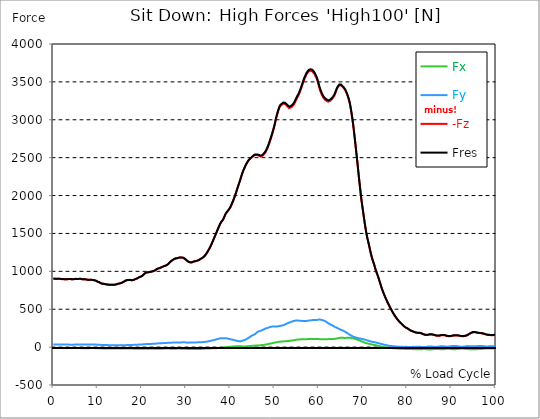
| Category |  Fx |  Fy |  -Fz |  Fres |
|---|---|---|---|---|
| 0.0 | -12.904 | 33.914 | 901.258 | 902.026 |
| 0.167348456675344 | -13.024 | 33.95 | 902.014 | 902.781 |
| 0.334696913350688 | -13.132 | 33.902 | 902.757 | 903.525 |
| 0.5020453700260321 | -12.916 | 33.854 | 901.21 | 901.966 |
| 0.669393826701376 | -12.64 | 33.83 | 899.699 | 900.455 |
| 0.83674228337672 | -12.64 | 33.686 | 900.743 | 901.498 |
| 1.0040907400520642 | -12.724 | 33.602 | 902.146 | 902.889 |
| 1.1621420602454444 | -13.012 | 33.471 | 902.997 | 903.741 |
| 1.3294905169207885 | -13.108 | 33.315 | 902.41 | 903.153 |
| 1.4968389735961325 | -13.168 | 33.183 | 901.114 | 901.846 |
| 1.6641874302714765 | -13.108 | 33.051 | 899.196 | 899.939 |
| 1.8315358869468206 | -13.06 | 32.979 | 897.493 | 898.224 |
| 1.9988843436221646 | -13.036 | 32.967 | 896.198 | 896.941 |
| 2.1662328002975086 | -13.228 | 33.099 | 896.773 | 897.505 |
| 2.333581256972853 | -13.431 | 33.075 | 897.373 | 898.116 |
| 2.5009297136481967 | -13.204 | 33.015 | 895.502 | 896.246 |
| 2.6682781703235405 | -13.06 | 32.811 | 894.375 | 895.106 |
| 2.8356266269988843 | -13.311 | 32.799 | 894.866 | 895.598 |
| 3.002975083674229 | -13.491 | 32.991 | 895.898 | 896.629 |
| 3.1703235403495724 | -13.491 | 32.967 | 896.354 | 897.097 |
| 3.337671997024917 | -13.323 | 32.919 | 896.761 | 897.493 |
| 3.4957233172182973 | -13.144 | 32.847 | 897.96 | 898.68 |
| 3.663071773893641 | -13.192 | 32.691 | 899.172 | 899.891 |
| 3.8304202305689854 | -13.12 | 32.595 | 898.056 | 898.776 |
| 3.997768687244329 | -12.904 | 32.487 | 896.401 | 897.109 |
| 4.165117143919673 | -12.772 | 32.523 | 895.586 | 896.306 |
| 4.332465600595017 | -12.784 | 32.619 | 895.106 | 895.826 |
| 4.499814057270361 | -12.892 | 32.727 | 895.238 | 895.958 |
| 4.667162513945706 | -12.868 | 32.799 | 896.593 | 897.313 |
| 4.834510970621049 | -12.952 | 32.871 | 898.476 | 899.196 |
| 5.001859427296393 | -13.06 | 32.955 | 899.939 | 900.671 |
| 5.169207883971737 | -13.06 | 33.063 | 899.831 | 900.575 |
| 5.336556340647081 | -12.988 | 33.159 | 899.567 | 900.299 |
| 5.503904797322425 | -12.904 | 33.279 | 898.2 | 898.944 |
| 5.671253253997769 | -12.976 | 33.327 | 899.663 | 900.407 |
| 5.82930457419115 | -13.275 | 33.351 | 901.198 | 901.942 |
| 5.996653030866494 | -13.467 | 33.291 | 900.935 | 901.678 |
| 6.164001487541838 | -13.455 | 33.099 | 900.203 | 900.947 |
| 6.331349944217181 | -13.659 | 33.111 | 899.292 | 900.035 |
| 6.498698400892526 | -13.539 | 33.075 | 896.114 | 896.857 |
| 6.66604685756787 | -13.455 | 33.147 | 893.715 | 894.459 |
| 6.833395314243213 | -13.599 | 33.339 | 893.643 | 894.399 |
| 7.000743770918558 | -13.767 | 33.531 | 894.015 | 894.783 |
| 7.168092227593902 | -13.875 | 33.566 | 894.291 | 895.058 |
| 7.335440684269246 | -13.875 | 33.495 | 893.655 | 894.423 |
| 7.50278914094459 | -13.779 | 33.447 | 891.76 | 892.528 |
| 7.6701375976199335 | -13.575 | 33.387 | 889.338 | 890.094 |
| 7.837486054295278 | -13.455 | 33.339 | 887.671 | 888.427 |
| 7.995537374488658 | -13.515 | 33.303 | 887.251 | 888.007 |
| 8.162885831164003 | -13.539 | 33.255 | 886.976 | 887.731 |
| 8.330234287839346 | -13.407 | 33.195 | 887.275 | 888.031 |
| 8.49758274451469 | -13.335 | 33.159 | 887.587 | 888.343 |
| 8.664931201190035 | -13.287 | 33.135 | 887.911 | 888.654 |
| 8.832279657865378 | -13.216 | 33.207 | 886.736 | 887.479 |
| 8.999628114540721 | -12.928 | 33.171 | 883.941 | 884.685 |
| 9.166976571216066 | -13.048 | 33.015 | 881.795 | 882.538 |
| 9.334325027891412 | -13.299 | 32.943 | 881.063 | 881.807 |
| 9.501673484566755 | -13.599 | 32.955 | 879.085 | 879.84 |
| 9.669021941242098 | -13.647 | 32.979 | 875.007 | 875.775 |
| 9.836370397917442 | -14.511 | 32.295 | 867.884 | 868.639 |
| 10.003718854592787 | -14.834 | 31.708 | 862.727 | 863.483 |
| 10.17106731126813 | -14.966 | 31.348 | 860.688 | 861.432 |
| 10.329118631461512 | -14.99 | 31.24 | 857.498 | 858.254 |
| 10.496467088136853 | -15.422 | 30.544 | 851.634 | 852.378 |
| 10.663815544812199 | -16.13 | 29.609 | 845.146 | 845.89 |
| 10.831164001487544 | -16.741 | 28.746 | 839.654 | 840.397 |
| 10.998512458162887 | -16.909 | 28.302 | 837.111 | 837.843 |
| 11.16586091483823 | -17.125 | 28.206 | 836.752 | 837.495 |
| 11.333209371513574 | -17.209 | 28.014 | 835.576 | 836.32 |
| 11.50055782818892 | -17.305 | 27.894 | 833.586 | 834.341 |
| 11.667906284864264 | -17.461 | 27.654 | 831.055 | 831.799 |
| 11.835254741539607 | -17.653 | 27.235 | 828.789 | 829.532 |
| 12.00260319821495 | -17.857 | 26.863 | 827.134 | 827.865 |
| 12.169951654890292 | -18.072 | 26.503 | 825.683 | 826.414 |
| 12.337300111565641 | -18.156 | 26.431 | 824.759 | 825.491 |
| 12.504648568240984 | -18.228 | 26.203 | 823.812 | 824.544 |
| 12.662699888434362 | -18.3 | 25.795 | 822.829 | 823.548 |
| 12.830048345109708 | -18.384 | 25.364 | 822.337 | 823.056 |
| 12.997396801785053 | -18.456 | 24.944 | 822.013 | 822.721 |
| 13.164745258460396 | -18.444 | 24.848 | 821.749 | 822.457 |
| 13.33209371513574 | -18.372 | 24.728 | 821.701 | 822.409 |
| 13.499442171811083 | -18.288 | 24.596 | 821.725 | 822.421 |
| 13.666790628486426 | -18.336 | 24.524 | 822.349 | 823.044 |
| 13.834139085161771 | -18.492 | 24.524 | 823.404 | 824.112 |
| 14.001487541837117 | -18.768 | 24.62 | 824.711 | 825.431 |
| 14.16883599851246 | -18.864 | 24.44 | 826.75 | 827.47 |
| 14.336184455187803 | -18.852 | 24.26 | 829.28 | 829.988 |
| 14.503532911863147 | -18.768 | 24.129 | 832.267 | 832.974 |
| 14.670881368538492 | -18.756 | 24.308 | 836.02 | 836.728 |
| 14.828932688731873 | -19.008 | 24.165 | 838.587 | 839.306 |
| 14.996281145407215 | -19.164 | 24.057 | 840.205 | 840.925 |
| 15.163629602082558 | -19.176 | 24.093 | 842.052 | 842.784 |
| 15.330978058757903 | -19.296 | 24.165 | 845.362 | 846.094 |
| 15.498326515433247 | -19.26 | 24.368 | 849.356 | 850.075 |
| 15.665674972108594 | -19.248 | 24.524 | 853.985 | 854.716 |
| 15.833023428783937 | -19.104 | 24.692 | 859.657 | 860.377 |
| 16.00037188545928 | -18.864 | 24.872 | 865.641 | 866.361 |
| 16.167720342134626 | -18.852 | 25.184 | 871.949 | 872.669 |
| 16.335068798809967 | -19.056 | 25.628 | 876.974 | 877.717 |
| 16.502417255485312 | -18.876 | 26.071 | 881.039 | 881.783 |
| 16.669765712160658 | -18.972 | 26.467 | 883.69 | 884.445 |
| 16.837114168836 | -18.84 | 26.611 | 884.481 | 885.225 |
| 17.004462625511344 | -18.588 | 26.839 | 884.685 | 885.44 |
| 17.16251394570472 | -18.6 | 27.462 | 886.04 | 886.82 |
| 17.32986240238007 | -18.792 | 27.99 | 886.796 | 887.599 |
| 17.497210859055414 | -19.08 | 28.47 | 884.157 | 884.973 |
| 17.664559315730756 | -19.44 | 28.889 | 881.687 | 882.538 |
| 17.8319077724061 | -19.667 | 29.117 | 882.311 | 883.174 |
| 17.999256229081443 | -19.811 | 29.357 | 883.965 | 884.829 |
| 18.166604685756788 | -19.799 | 29.573 | 887.035 | 887.911 |
| 18.333953142432133 | -20.135 | 29.837 | 891.101 | 891.976 |
| 18.501301599107478 | -20.447 | 30.317 | 895.886 | 896.785 |
| 18.668650055782823 | -20.651 | 31.12 | 900.767 | 901.702 |
| 18.835998512458165 | -20.567 | 31.264 | 903.249 | 904.184 |
| 19.00334696913351 | -20.555 | 31.78 | 907.338 | 908.286 |
| 19.170695425808855 | -20.795 | 32.571 | 913.634 | 914.606 |
| 19.338043882484197 | -21.059 | 33.423 | 919.87 | 920.878 |
| 19.496095202677576 | -21.214 | 34.106 | 923.972 | 924.991 |
| 19.66344365935292 | -21.226 | 34.166 | 927.306 | 928.337 |
| 19.830792116028263 | -21.406 | 34.562 | 931.263 | 932.294 |
| 19.998140572703612 | -21.658 | 35.03 | 935.988 | 937.043 |
| 20.165489029378953 | -22.042 | 35.773 | 943.795 | 944.886 |
| 20.3328374860543 | -22.186 | 36.589 | 952.226 | 953.329 |
| 20.500185942729644 | -22.27 | 37.56 | 962.503 | 963.642 |
| 20.667534399404985 | -22.342 | 38.447 | 971.785 | 972.948 |
| 20.83488285608033 | -22.438 | 39.263 | 978.657 | 979.844 |
| 21.002231312755672 | -22.174 | 39.85 | 983.202 | 984.413 |
| 21.16957976943102 | -22.222 | 39.994 | 985.576 | 986.788 |
| 21.336928226106362 | -22.402 | 40.354 | 986.668 | 987.903 |
| 21.504276682781704 | -22.606 | 40.75 | 987.519 | 988.79 |
| 21.67162513945705 | -22.51 | 41.05 | 988.371 | 989.654 |
| 21.82967645965043 | -22.39 | 41.338 | 989.222 | 990.505 |
| 21.997024916325774 | -22.462 | 41.901 | 992.46 | 993.767 |
| 22.16437337300112 | -22.486 | 42.477 | 995.554 | 996.873 |
| 22.33172182967646 | -22.318 | 43.028 | 997.904 | 999.248 |
| 22.499070286351806 | -22.162 | 43.544 | 1000.483 | 1001.838 |
| 22.666418743027148 | -22.054 | 44 | 1003.421 | 1004.788 |
| 22.833767199702496 | -21.934 | 44.444 | 1006.359 | 1007.738 |
| 23.00111565637784 | -21.946 | 45.223 | 1012.067 | 1013.482 |
| 23.168464113053183 | -22.198 | 46.194 | 1019.323 | 1020.774 |
| 23.335812569728528 | -22.33 | 47.118 | 1026.23 | 1027.717 |
| 23.50316102640387 | -22.078 | 48.137 | 1031.963 | 1033.462 |
| 23.670509483079215 | -21.682 | 49.133 | 1036.76 | 1038.295 |
| 23.83785793975456 | -21.502 | 49.72 | 1039.314 | 1040.861 |
| 23.995909259947936 | -21.598 | 50.092 | 1041.46 | 1043.019 |
| 24.163257716623285 | -21.586 | 50.44 | 1044.998 | 1046.569 |
| 24.330606173298627 | -21.442 | 51.027 | 1049.915 | 1051.498 |
| 24.49795462997397 | -21.202 | 51.651 | 1054.004 | 1055.611 |
| 24.665303086649313 | -20.807 | 52.37 | 1057.11 | 1058.741 |
| 24.83265154332466 | -20.375 | 52.958 | 1062.795 | 1064.426 |
| 25.0 | -19.907 | 53.282 | 1068.143 | 1069.75 |
| 25.167348456675345 | -19.523 | 53.702 | 1071.225 | 1072.844 |
| 25.334696913350694 | -18.792 | 54.517 | 1072.317 | 1073.972 |
| 25.502045370026035 | -18.456 | 55.249 | 1077.126 | 1078.793 |
| 25.669393826701377 | -18.3 | 55.68 | 1082.594 | 1084.261 |
| 25.836742283376722 | -18.048 | 56.016 | 1088.422 | 1090.077 |
| 26.004090740052067 | -18.252 | 56.64 | 1096.745 | 1098.4 |
| 26.17143919672741 | -19.416 | 57.707 | 1106.471 | 1108.198 |
| 26.329490516920792 | -20.507 | 58.187 | 1118.691 | 1120.43 |
| 26.49683897359613 | -21.011 | 58.558 | 1128.597 | 1130.36 |
| 26.66418743027148 | -21.346 | 58.906 | 1136.14 | 1137.903 |
| 26.831535886946828 | -21.442 | 59.194 | 1142.868 | 1144.63 |
| 26.998884343622166 | -21.214 | 59.326 | 1149.307 | 1151.07 |
| 27.166232800297514 | -20.951 | 59.494 | 1156.131 | 1157.882 |
| 27.333581256972852 | -20.831 | 59.626 | 1161.971 | 1163.71 |
| 27.5009297136482 | -20.843 | 59.71 | 1166.576 | 1168.315 |
| 27.668278170323543 | -21.094 | 59.722 | 1169.994 | 1171.733 |
| 27.835626626998888 | -20.915 | 59.878 | 1171.253 | 1173.016 |
| 28.002975083674233 | -19.943 | 59.926 | 1172.165 | 1173.928 |
| 28.170323540349575 | -19.344 | 60.321 | 1175.654 | 1177.429 |
| 28.33767199702492 | -19.26 | 60.861 | 1178.916 | 1180.727 |
| 28.50502045370026 | -19.488 | 61.209 | 1180.967 | 1182.79 |
| 28.663071773893645 | -19.967 | 61.664 | 1181.902 | 1183.761 |
| 28.830420230568986 | -20.339 | 62.048 | 1181.855 | 1183.737 |
| 28.99776868724433 | -20.531 | 62.408 | 1181.195 | 1183.114 |
| 29.165117143919673 | -20.711 | 62.756 | 1180.487 | 1182.418 |
| 29.33246560059502 | -20.639 | 63.092 | 1178.029 | 1179.984 |
| 29.499814057270367 | -21.142 | 63.092 | 1173.4 | 1175.379 |
| 29.66716251394571 | -21.55 | 62.768 | 1167.416 | 1169.395 |
| 29.834510970621054 | -21.982 | 62.516 | 1159.093 | 1161.084 |
| 30.00185942729639 | -22.558 | 61.7 | 1150.854 | 1152.821 |
| 30.169207883971744 | -23.313 | 60.537 | 1142.256 | 1144.211 |
| 30.33655634064708 | -24.236 | 58.774 | 1133.346 | 1135.252 |
| 30.50390479732243 | -24.584 | 58.798 | 1126.45 | 1128.381 |
| 30.671253253997772 | -24.584 | 59.254 | 1121.773 | 1123.752 |
| 30.829304574191156 | -24.524 | 59.674 | 1118.451 | 1120.466 |
| 30.996653030866494 | -24.884 | 60.189 | 1117.156 | 1119.231 |
| 31.164001487541842 | -25.316 | 60.645 | 1116.376 | 1118.499 |
| 31.331349944217187 | -25.915 | 61.113 | 1118.019 | 1120.19 |
| 31.498698400892525 | -26.107 | 61.868 | 1122.732 | 1124.951 |
| 31.666046857567874 | -26.215 | 62.276 | 1127.218 | 1129.46 |
| 31.833395314243212 | -26.227 | 62.276 | 1130.168 | 1132.41 |
| 32.00074377091856 | -25.843 | 61.724 | 1131.247 | 1133.454 |
| 32.1680922275939 | -25.652 | 61.581 | 1132.866 | 1135.049 |
| 32.33544068426925 | -25.64 | 61.808 | 1134.977 | 1137.171 |
| 32.50278914094459 | -25.532 | 62.612 | 1138.634 | 1140.877 |
| 32.670137597619934 | -25.352 | 63.439 | 1142.712 | 1144.99 |
| 32.83748605429528 | -24.86 | 63.775 | 1147.293 | 1149.583 |
| 33.004834510970625 | -24.428 | 64.171 | 1152.042 | 1154.344 |
| 33.162885831164004 | -24.248 | 64.77 | 1157.378 | 1159.705 |
| 33.33023428783935 | -24.057 | 64.89 | 1164.142 | 1166.492 |
| 33.497582744514695 | -23.169 | 65.382 | 1169.634 | 1171.997 |
| 33.664931201190036 | -22.078 | 65.706 | 1174.431 | 1176.806 |
| 33.83227965786538 | -21.586 | 66.617 | 1182.394 | 1184.829 |
| 33.99962811454073 | -21.106 | 67.541 | 1190.369 | 1192.851 |
| 34.16697657121607 | -20.567 | 68.488 | 1199.903 | 1202.445 |
| 34.33432502789141 | -20.027 | 69.4 | 1210.696 | 1213.286 |
| 34.50167348456676 | -19.631 | 70.287 | 1224.379 | 1227.03 |
| 34.6690219412421 | -19.332 | 71.534 | 1238.35 | 1241.049 |
| 34.83637039791744 | -19.02 | 73.309 | 1253.077 | 1255.859 |
| 35.00371885459279 | -18.684 | 75.432 | 1269.95 | 1272.84 |
| 35.17106731126814 | -18.408 | 77.554 | 1287.027 | 1290.025 |
| 35.338415767943474 | -17.917 | 79.845 | 1305.759 | 1308.853 |
| 35.49646708813686 | -17.401 | 82.195 | 1325.151 | 1328.329 |
| 35.6638155448122 | -16.897 | 84.534 | 1345.55 | 1348.823 |
| 35.831164001487544 | -16.393 | 86.836 | 1367.352 | 1370.697 |
| 35.998512458162885 | -15.71 | 89.019 | 1389.142 | 1392.547 |
| 36.165860914838234 | -15.254 | 91.046 | 1411.879 | 1415.333 |
| 36.333209371513576 | -14.87 | 93.036 | 1434.353 | 1437.866 |
| 36.50055782818892 | -14.451 | 95.267 | 1457.654 | 1461.227 |
| 36.667906284864266 | -14.055 | 98.121 | 1481.075 | 1484.744 |
| 36.83525474153961 | -13.767 | 101.419 | 1504.172 | 1507.973 |
| 37.002603198214956 | -13.263 | 104.333 | 1527.893 | 1531.79 |
| 37.1699516548903 | -12.268 | 106.852 | 1550.99 | 1554.959 |
| 37.337300111565646 | -11.285 | 109.274 | 1573.535 | 1577.589 |
| 37.50464856824098 | -10.565 | 112.896 | 1595.673 | 1599.859 |
| 37.66269988843437 | -9.366 | 115.558 | 1617.919 | 1622.2 |
| 37.83004834510971 | -8.563 | 117.681 | 1636.567 | 1640.932 |
| 37.99739680178505 | -7.651 | 118.268 | 1651.533 | 1655.887 |
| 38.16474525846039 | -7.016 | 117.621 | 1663.226 | 1667.495 |
| 38.33209371513574 | -6.272 | 116.829 | 1676.298 | 1680.471 |
| 38.49944217181109 | -5.097 | 116.577 | 1696.073 | 1700.186 |
| 38.666790628486424 | -3.778 | 117.177 | 1719.146 | 1723.26 |
| 38.83413908516178 | -2.554 | 118.448 | 1741.164 | 1745.289 |
| 39.001487541837115 | -1.355 | 118.46 | 1760.831 | 1764.885 |
| 39.16883599851246 | -0.156 | 117.177 | 1775.774 | 1779.695 |
| 39.336184455187805 | 1.031 | 114.443 | 1787.622 | 1791.34 |
| 39.503532911863154 | 2.207 | 111.708 | 1799.471 | 1802.996 |
| 39.670881368538495 | 2.914 | 108.854 | 1813.238 | 1816.584 |
| 39.83822982521384 | 3.382 | 105.952 | 1827.928 | 1831.106 |
| 39.996281145407224 | 3.874 | 104.093 | 1843.566 | 1846.624 |
| 40.163629602082565 | 4.677 | 102.318 | 1863.474 | 1866.412 |
| 40.33097805875791 | 5.852 | 100.088 | 1886.007 | 1888.813 |
| 40.498326515433256 | 7.075 | 97.953 | 1909.44 | 1912.102 |
| 40.6656749721086 | 7.999 | 95.675 | 1933.077 | 1935.607 |
| 40.83302342878393 | 9.234 | 93.024 | 1959.136 | 1961.523 |
| 41.00037188545929 | 10.002 | 90.47 | 1986.815 | 1989.069 |
| 41.16772034213463 | 10.889 | 87.952 | 2014.205 | 2016.328 |
| 41.33506879880997 | 11.477 | 85.829 | 2042.543 | 2044.534 |
| 41.50241725548531 | 11.956 | 83.502 | 2072.716 | 2074.562 |
| 41.66976571216066 | 12.28 | 80.277 | 2103.572 | 2105.263 |
| 41.837114168836 | 11.92 | 78.274 | 2133.481 | 2135.064 |
| 42.004462625511344 | 11.489 | 77.506 | 2163.006 | 2164.541 |
| 42.17181108218669 | 11.045 | 77.207 | 2191.835 | 2193.334 |
| 42.32986240238007 | 10.481 | 78.058 | 2221.576 | 2223.075 |
| 42.497210859055414 | 10.193 | 80.372 | 2253.704 | 2255.275 |
| 42.66455931573076 | 9.774 | 82.639 | 2284.392 | 2286.047 |
| 42.831907772406105 | 9.45 | 85.889 | 2311.207 | 2312.982 |
| 42.999256229081446 | 9.138 | 89.81 | 2336.259 | 2338.189 |
| 43.16660468575679 | 8.946 | 92.713 | 2357.893 | 2359.943 |
| 43.33395314243214 | 9.006 | 95.891 | 2379.347 | 2381.494 |
| 43.50130159910748 | 9.426 | 100.568 | 2399.878 | 2402.204 |
| 43.66865005578282 | 10.014 | 105.952 | 2418.742 | 2421.296 |
| 43.83599851245817 | 10.745 | 111.684 | 2436.251 | 2439.057 |
| 44.00334696913351 | 11.441 | 117.729 | 2451.817 | 2454.899 |
| 44.17069542580886 | 12.208 | 124.013 | 2465.188 | 2468.57 |
| 44.3380438824842 | 12.94 | 130.536 | 2476.305 | 2480.034 |
| 44.49609520267758 | 13.755 | 137.012 | 2485.755 | 2489.844 |
| 44.66344365935292 | 14.799 | 143.5 | 2494.533 | 2499.006 |
| 44.83079211602827 | 15.758 | 149.652 | 2503.132 | 2508.013 |
| 44.99814057270361 | 16.669 | 155.133 | 2510.999 | 2516.227 |
| 45.16548902937895 | 17.521 | 159.786 | 2517.93 | 2523.471 |
| 45.332837486054295 | 18.312 | 163.407 | 2527.584 | 2533.328 |
| 45.500185942729644 | 19.116 | 168.24 | 2534.156 | 2540.188 |
| 45.66753439940499 | 19.631 | 174.212 | 2535.439 | 2541.855 |
| 45.83488285608033 | 20.363 | 183.53 | 2534.276 | 2541.543 |
| 46.00223131275568 | 21.106 | 192.968 | 2533.041 | 2541.183 |
| 46.16957976943102 | 21.766 | 199.6 | 2532.405 | 2541.279 |
| 46.336928226106366 | 22.462 | 205.788 | 2531.206 | 2540.764 |
| 46.50427668278171 | 23.265 | 209.71 | 2526.804 | 2536.782 |
| 46.671625139457056 | 23.001 | 210.669 | 2517.99 | 2528.088 |
| 46.829676459650436 | 24.248 | 214.71 | 2515.975 | 2526.409 |
| 46.99702491632577 | 25.628 | 218.836 | 2517.954 | 2528.747 |
| 47.16437337300112 | 26.767 | 222.817 | 2521.888 | 2533.041 |
| 47.33172182967646 | 27.798 | 226.955 | 2528.747 | 2540.236 |
| 47.49907028635181 | 29.009 | 231.632 | 2537.993 | 2549.878 |
| 47.66641874302716 | 30.472 | 237.052 | 2548.942 | 2561.294 |
| 47.83376719970249 | 31.948 | 242.233 | 2561.055 | 2573.85 |
| 48.001115656377834 | 33.351 | 245.938 | 2575.613 | 2588.685 |
| 48.16846411305319 | 35.006 | 249.08 | 2593.878 | 2607.141 |
| 48.33581256972853 | 36.72 | 251.779 | 2613.809 | 2627.228 |
| 48.50316102640387 | 38.735 | 254.417 | 2637.314 | 2650.853 |
| 48.67050948307921 | 41.134 | 257.955 | 2662.977 | 2676.732 |
| 48.837857939754564 | 43.568 | 261.516 | 2692.31 | 2706.269 |
| 49.005206396429905 | 45.775 | 265.03 | 2720.96 | 2735.135 |
| 49.163257716623285 | 47.645 | 266.481 | 2749.61 | 2763.749 |
| 49.33060617329863 | 50.008 | 269.599 | 2780.658 | 2794.989 |
| 49.49795462997397 | 52.191 | 271.038 | 2812.929 | 2827.236 |
| 49.66530308664932 | 54.385 | 271.674 | 2846.4 | 2860.575 |
| 49.832651543324666 | 56.832 | 272.957 | 2882.173 | 2896.324 |
| 50.0 | 59.146 | 273.605 | 2918.39 | 2932.445 |
| 50.16734845667534 | 60.909 | 272.969 | 2962.413 | 2976.252 |
| 50.33469691335069 | 62.576 | 272.202 | 3008.824 | 3022.435 |
| 50.50204537002604 | 64.459 | 272.381 | 3046.455 | 3059.971 |
| 50.66939382670139 | 65.91 | 272.537 | 3080.682 | 3094.089 |
| 50.836742283376715 | 67.541 | 273.473 | 3113.361 | 3126.756 |
| 51.00409074005207 | 69.603 | 275.691 | 3142.598 | 3156.113 |
| 51.17143919672741 | 70.623 | 276.95 | 3167.542 | 3181.057 |
| 51.32949051692079 | 71.75 | 279.277 | 3183.48 | 3197.139 |
| 51.496838973596134 | 73.033 | 282.539 | 3193.289 | 3207.188 |
| 51.66418743027148 | 74.089 | 285.345 | 3198.926 | 3213.029 |
| 51.831535886946824 | 74.784 | 287.384 | 3204.898 | 3219.157 |
| 51.99888434362217 | 75.504 | 289.686 | 3212.573 | 3227 |
| 52.16623280029752 | 76.139 | 292.768 | 3214.492 | 3229.194 |
| 52.33358125697285 | 76.643 | 296.198 | 3210.246 | 3225.297 |
| 52.5009297136482 | 77.59 | 301.655 | 3203.147 | 3218.725 |
| 52.668278170323546 | 78.55 | 307.207 | 3194.668 | 3210.822 |
| 52.835626626998895 | 79.293 | 311.56 | 3183.588 | 3200.257 |
| 53.00297508367424 | 80.037 | 315.902 | 3172.519 | 3189.692 |
| 53.17032354034958 | 80.876 | 319.919 | 3161.402 | 3179.138 |
| 53.33767199702492 | 81.764 | 323.697 | 3153.727 | 3171.979 |
| 53.50502045370027 | 82.927 | 327.018 | 3158.943 | 3177.579 |
| 53.663071773893655 | 84.534 | 330.832 | 3162.553 | 3181.633 |
| 53.83042023056899 | 86.237 | 334.526 | 3166.211 | 3185.734 |
| 53.99776868724433 | 88.06 | 338.051 | 3175.649 | 3195.556 |
| 54.16511714391967 | 89.846 | 341.565 | 3185.422 | 3205.725 |
| 54.33246560059503 | 91.166 | 344.791 | 3198.398 | 3219.001 |
| 54.49981405727037 | 92.677 | 347.405 | 3214.564 | 3235.394 |
| 54.667162513945705 | 94.487 | 349.024 | 3236.006 | 3256.921 |
| 54.834510970621054 | 96.154 | 350.188 | 3255.985 | 3276.912 |
| 55.0018594272964 | 97.689 | 350.943 | 3274.729 | 3295.632 |
| 55.169207883971744 | 99.176 | 351.747 | 3294.936 | 3315.815 |
| 55.336556340647086 | 99.944 | 350.499 | 3313.392 | 3333.995 |
| 55.50390479732243 | 100.46 | 348.389 | 3330.17 | 3350.401 |
| 55.671253253997776 | 101.167 | 347.393 | 3354.598 | 3374.577 |
| 55.83860171067312 | 101.983 | 347.201 | 3380.633 | 3400.445 |
| 55.9966530308665 | 102.51 | 346.53 | 3409.163 | 3428.758 |
| 56.16400148754184 | 102.966 | 345.642 | 3437.057 | 3456.401 |
| 56.33134994421718 | 103.506 | 344.923 | 3465.215 | 3484.343 |
| 56.498698400892536 | 104.021 | 344.623 | 3495.831 | 3514.779 |
| 56.66604685756788 | 104.429 | 343.652 | 3522.634 | 3541.33 |
| 56.83339531424321 | 104.585 | 344.527 | 3547.614 | 3566.262 |
| 57.00074377091856 | 104.861 | 345.151 | 3569.968 | 3588.556 |
| 57.16809222759391 | 104.921 | 345.559 | 3591.05 | 3609.579 |
| 57.33544068426925 | 104.885 | 346.014 | 3608.679 | 3627.159 |
| 57.5027891409446 | 105.652 | 347.909 | 3622.17 | 3640.783 |
| 57.670137597619934 | 106.204 | 349.672 | 3633.107 | 3651.863 |
| 57.83748605429528 | 106.935 | 350.715 | 3641.394 | 3660.234 |
| 58.004834510970625 | 107.931 | 351.603 | 3646.071 | 3665.019 |
| 58.16288583116401 | 108.518 | 353.09 | 3648.026 | 3667.13 |
| 58.330234287839346 | 108.878 | 354.505 | 3646.227 | 3665.487 |
| 58.497582744514695 | 108.638 | 355.38 | 3641.514 | 3660.894 |
| 58.66493120119004 | 108.243 | 356.819 | 3633.023 | 3652.559 |
| 58.832279657865385 | 107.703 | 356.759 | 3621.643 | 3641.226 |
| 58.999628114540734 | 107.271 | 357.059 | 3607.804 | 3627.447 |
| 59.16697657121607 | 107.067 | 356.879 | 3591.314 | 3611.042 |
| 59.33432502789142 | 107.127 | 358.51 | 3571.215 | 3591.206 |
| 59.50167348456676 | 107.043 | 358.462 | 3549.053 | 3569.164 |
| 59.66902194124211 | 106.396 | 359.062 | 3522.298 | 3542.589 |
| 59.83637039791745 | 105.748 | 360.693 | 3488.744 | 3509.335 |
| 60.00371885459278 | 105.532 | 363.631 | 3451.88 | 3472.938 |
| 60.17106731126813 | 105.041 | 365.286 | 3416.478 | 3437.873 |
| 60.33841576794349 | 103.722 | 363.331 | 3385.262 | 3406.597 |
| 60.49646708813685 | 103.242 | 361.017 | 3359.371 | 3380.585 |
| 60.6638155448122 | 103.122 | 358.51 | 3335.506 | 3356.613 |
| 60.831164001487544 | 103.266 | 355.908 | 3314.256 | 3335.254 |
| 60.99851245816289 | 103.374 | 352.946 | 3296.255 | 3317.062 |
| 61.16586091483824 | 103.35 | 349.372 | 3281.541 | 3302.072 |
| 61.333209371513576 | 103.446 | 345.978 | 3270.544 | 3290.787 |
| 61.50055782818892 | 103.482 | 341.757 | 3261.322 | 3281.157 |
| 61.667906284864266 | 103.937 | 335.005 | 3254.27 | 3273.482 |
| 61.835254741539615 | 104.477 | 327.894 | 3246.799 | 3265.387 |
| 62.002603198214956 | 104.981 | 321.13 | 3240.011 | 3258.024 |
| 62.16995165489029 | 105.364 | 315.434 | 3239.016 | 3256.513 |
| 62.33730011156564 | 105.64 | 309.306 | 3241.45 | 3258.384 |
| 62.504648568240995 | 105.868 | 302.998 | 3247.351 | 3263.696 |
| 62.67199702491633 | 105.4 | 298.273 | 3255.302 | 3271.131 |
| 62.83004834510971 | 105.053 | 294.303 | 3262.917 | 3278.291 |
| 62.99739680178505 | 105.328 | 290.178 | 3271.587 | 3286.506 |
| 63.1647452584604 | 106.252 | 284.026 | 3285.63 | 3299.949 |
| 63.33209371513575 | 107.331 | 277.67 | 3299.949 | 3313.68 |
| 63.4994421718111 | 108.506 | 271.722 | 3316.582 | 3329.762 |
| 63.666790628486424 | 109.862 | 266.325 | 3338.061 | 3350.7 |
| 63.83413908516177 | 111.253 | 261.277 | 3364.372 | 3376.508 |
| 64.00148754183712 | 113.159 | 257.391 | 3390.167 | 3401.956 |
| 64.16883599851248 | 115.126 | 253.206 | 3413.636 | 3425.077 |
| 64.3361844551878 | 117.249 | 248.241 | 3430.701 | 3441.806 |
| 64.50353291186315 | 119.3 | 243.768 | 3444.169 | 3454.986 |
| 64.6708813685385 | 120.942 | 239.738 | 3455.309 | 3465.887 |
| 64.83822982521384 | 121.914 | 234.318 | 3458.571 | 3468.813 |
| 65.00557828188919 | 122.669 | 228.214 | 3456.329 | 3466.21 |
| 65.16362960208257 | 122.801 | 225.12 | 3448.858 | 3458.583 |
| 65.3309780587579 | 122.537 | 221.354 | 3439.264 | 3448.762 |
| 65.49832651543326 | 122.118 | 217.301 | 3428.746 | 3437.98 |
| 65.6656749721086 | 121.794 | 213.391 | 3418.205 | 3427.175 |
| 65.83302342878395 | 121.494 | 207.635 | 3405.673 | 3414.308 |
| 66.00037188545929 | 121.098 | 200.523 | 3390.167 | 3398.37 |
| 66.16772034213463 | 121.338 | 194.287 | 3370.092 | 3377.995 |
| 66.33506879880998 | 122.226 | 188.807 | 3347.271 | 3354.934 |
| 66.50241725548531 | 122.909 | 182.991 | 3322.674 | 3330.074 |
| 66.66976571216065 | 122.981 | 176.563 | 3293.941 | 3301.064 |
| 66.83711416883601 | 122.885 | 170.063 | 3261.058 | 3267.894 |
| 67.00446262551135 | 122.561 | 163.683 | 3221.891 | 3228.475 |
| 67.1718110821867 | 121.446 | 157.483 | 3172.926 | 3179.258 |
| 67.32986240238007 | 119.803 | 151.511 | 3115.759 | 3121.851 |
| 67.49721085905541 | 117.992 | 146.258 | 3052.895 | 3058.784 |
| 67.66455931573076 | 116.038 | 141.989 | 2985.319 | 2991.075 |
| 67.83190777240611 | 114.239 | 137.972 | 2911.218 | 2916.866 |
| 67.99925622908145 | 111.72 | 133.642 | 2827.44 | 2832.968 |
| 68.16660468575678 | 109.07 | 129.865 | 2742.582 | 2748.027 |
| 68.33395314243214 | 106.42 | 127.011 | 2655.446 | 2660.855 |
| 68.50130159910749 | 103.254 | 123.833 | 2563.225 | 2568.562 |
| 68.66865005578282 | 100.34 | 121.842 | 2477.588 | 2482.901 |
| 68.83599851245816 | 96.718 | 119.192 | 2383.472 | 2388.713 |
| 69.00334696913352 | 92.833 | 116.781 | 2285.327 | 2290.508 |
| 69.17069542580886 | 89.019 | 114.718 | 2194.39 | 2199.522 |
| 69.3380438824842 | 85.061 | 112.788 | 2108.309 | 2113.381 |
| 69.50539233915956 | 80.253 | 110.953 | 2019.17 | 2024.159 |
| 69.66344365935292 | 75.971 | 109.19 | 1935.607 | 1940.512 |
| 69.83079211602826 | 72.338 | 107.151 | 1866.316 | 1871.149 |
| 69.99814057270362 | 68.632 | 104.945 | 1799.351 | 1804.112 |
| 70.16548902937896 | 64.471 | 102.582 | 1727.925 | 1732.566 |
| 70.33283748605429 | 60.777 | 100.268 | 1660.983 | 1665.517 |
| 70.50018594272964 | 57.383 | 97.318 | 1596.165 | 1600.554 |
| 70.667534399405 | 54.097 | 94.32 | 1536.671 | 1540.892 |
| 70.83488285608033 | 51.003 | 91.178 | 1482.298 | 1486.339 |
| 71.00223131275568 | 48.821 | 88.191 | 1435.336 | 1439.222 |
| 71.16957976943102 | 46.998 | 85.301 | 1394.25 | 1397.992 |
| 71.33692822610637 | 45.079 | 82.543 | 1353.86 | 1357.446 |
| 71.50427668278171 | 42.405 | 79.437 | 1308.949 | 1312.331 |
| 71.67162513945706 | 39.659 | 76.463 | 1264.29 | 1267.492 |
| 71.8389735961324 | 37.044 | 73.525 | 1222.88 | 1225.89 |
| 71.99702491632577 | 34.55 | 70.671 | 1184.757 | 1187.587 |
| 72.16437337300113 | 32.343 | 68.608 | 1152.126 | 1154.812 |
| 72.33172182967647 | 30.58 | 67.385 | 1122.768 | 1125.383 |
| 72.49907028635181 | 29.261 | 66.773 | 1095.846 | 1098.448 |
| 72.66641874302715 | 27.426 | 64.806 | 1060.588 | 1063.095 |
| 72.8337671997025 | 25.268 | 62.144 | 1026.326 | 1028.677 |
| 73.00111565637783 | 23.277 | 59.554 | 995.686 | 997.892 |
| 73.16846411305319 | 21.202 | 57.407 | 970.514 | 972.601 |
| 73.33581256972853 | 18.972 | 55.249 | 944.491 | 946.445 |
| 73.50316102640387 | 16.669 | 52.838 | 915.685 | 917.496 |
| 73.67050948307921 | 14.463 | 50.08 | 884.277 | 885.932 |
| 73.83785793975457 | 12.268 | 46.962 | 854.5 | 855.975 |
| 74.00520639642991 | 10.026 | 43.964 | 822.625 | 823.932 |
| 74.16325771662328 | 7.747 | 41.757 | 791.373 | 792.596 |
| 74.33060617329863 | 5.612 | 39.263 | 762.639 | 763.754 |
| 74.49795462997398 | 4.101 | 36.457 | 736.832 | 737.815 |
| 74.66530308664932 | 2.434 | 34.046 | 711.168 | 712.056 |
| 74.83265154332466 | 0.756 | 31.768 | 687.447 | 688.251 |
| 75.00000000000001 | -1.019 | 29.357 | 664.026 | 664.758 |
| 75.16734845667534 | -2.914 | 26.683 | 642.068 | 642.716 |
| 75.3346969133507 | -4.521 | 24.596 | 619.379 | 619.979 |
| 75.50204537002605 | -5.96 | 22.618 | 598.153 | 598.716 |
| 75.66939382670138 | -7.267 | 20.675 | 577.622 | 578.161 |
| 75.83674228337672 | -8.527 | 18.996 | 558.002 | 558.53 |
| 76.00409074005208 | -9.618 | 17.533 | 539.954 | 540.482 |
| 76.17143919672742 | -10.625 | 16.322 | 521.27 | 521.786 |
| 76.33878765340276 | -11.549 | 14.906 | 502.07 | 502.586 |
| 76.49683897359614 | -12.88 | 13.743 | 483.458 | 484.01 |
| 76.66418743027148 | -13.791 | 12.868 | 466.345 | 466.933 |
| 76.83153588694682 | -14.499 | 11.824 | 449.22 | 449.82 |
| 76.99888434362218 | -15.242 | 10.865 | 432.755 | 433.39 |
| 77.16623280029752 | -16.022 | 10.11 | 416.577 | 417.261 |
| 77.33358125697285 | -16.753 | 9.318 | 402.186 | 402.918 |
| 77.5009297136482 | -17.557 | 8.347 | 389.235 | 390.002 |
| 77.66827817032356 | -18.204 | 7.435 | 375.611 | 376.403 |
| 77.83562662699889 | -19.032 | 6.92 | 362.636 | 363.511 |
| 78.00297508367423 | -19.895 | 6.344 | 350.955 | 351.938 |
| 78.17032354034959 | -20.315 | 5.864 | 339.526 | 340.546 |
| 78.33767199702493 | -21.07 | 5.229 | 329.153 | 330.256 |
| 78.50502045370027 | -21.862 | 5.145 | 319.523 | 320.698 |
| 78.67236891037561 | -22.534 | 4.893 | 310.769 | 311.992 |
| 78.83042023056899 | -22.749 | 4.041 | 301.127 | 302.386 |
| 78.99776868724433 | -22.713 | 3.106 | 290.934 | 292.205 |
| 79.16511714391969 | -22.833 | 2.674 | 280.956 | 282.275 |
| 79.33246560059503 | -23.385 | 2.794 | 271.866 | 273.281 |
| 79.49981405727036 | -24.212 | 3.082 | 264.155 | 265.678 |
| 79.66716251394571 | -25.148 | 3.49 | 258.123 | 259.754 |
| 79.83451097062107 | -25.664 | 3.538 | 253.11 | 254.825 |
| 80.00185942729641 | -25.759 | 3.238 | 247.869 | 249.62 |
| 80.16920788397174 | -25.64 | 2.758 | 242.461 | 244.223 |
| 80.33655634064709 | -25.292 | 2.075 | 235.613 | 237.352 |
| 80.50390479732243 | -24.836 | 1.811 | 228.154 | 229.905 |
| 80.67125325399778 | -24.704 | 1.715 | 222.014 | 223.777 |
| 80.83860171067312 | -25.244 | 2.111 | 216.521 | 218.356 |
| 80.99665303086651 | -26.131 | 2.854 | 211.724 | 213.679 |
| 81.16400148754184 | -27.091 | 3.706 | 208.33 | 210.429 |
| 81.3313499442172 | -26.995 | 3.586 | 205.632 | 207.743 |
| 81.49869840089255 | -26.671 | 3.358 | 201.795 | 203.893 |
| 81.66604685756786 | -26.407 | 2.902 | 196.794 | 198.869 |
| 81.83339531424322 | -26.947 | 3.19 | 193.292 | 195.475 |
| 82.00074377091858 | -27.079 | 3.322 | 190.234 | 192.465 |
| 82.16809222759392 | -27.738 | 4.137 | 188.183 | 190.558 |
| 82.33544068426926 | -28.542 | 5.181 | 187.68 | 190.222 |
| 82.50278914094459 | -29.141 | 5.756 | 187.968 | 190.618 |
| 82.67013759761994 | -29.441 | 5.924 | 187.884 | 190.594 |
| 82.83748605429528 | -29.153 | 5.181 | 186.672 | 189.323 |
| 83.00483451097062 | -28.877 | 4.353 | 184.478 | 187.116 |
| 83.17218296764597 | -28.386 | 3.358 | 181.456 | 184.034 |
| 83.33023428783935 | -27.558 | 2.135 | 177.702 | 180.185 |
| 83.4975827445147 | -26.635 | 1.127 | 173.457 | 175.867 |
| 83.66493120119004 | -26.179 | 1.031 | 168.852 | 171.274 |
| 83.83227965786537 | -26.047 | 1.163 | 164.822 | 167.281 |
| 83.99962811454073 | -26.383 | 1.751 | 162.148 | 164.714 |
| 84.16697657121607 | -27.043 | 2.698 | 160.433 | 163.155 |
| 84.33432502789142 | -27.858 | 3.921 | 159.498 | 162.412 |
| 84.50167348456677 | -28.65 | 5.301 | 159.582 | 162.7 |
| 84.6690219412421 | -29.501 | 6.62 | 160.649 | 163.959 |
| 84.83637039791745 | -30.472 | 7.843 | 162.412 | 165.914 |
| 85.0037188545928 | -31.12 | 8.598 | 164.702 | 168.336 |
| 85.17106731126813 | -31.168 | 8.778 | 166.142 | 169.775 |
| 85.33841576794349 | -30.784 | 8.491 | 166.705 | 170.255 |
| 85.50576422461883 | -30.125 | 7.807 | 166.261 | 169.667 |
| 85.66381554481221 | -29.201 | 6.968 | 165.062 | 168.288 |
| 85.83116400148755 | -28.002 | 5.888 | 163.443 | 166.453 |
| 85.99851245816289 | -26.791 | 4.617 | 161.309 | 164.103 |
| 86.16586091483823 | -25.556 | 3.418 | 158.37 | 160.985 |
| 86.33320937151358 | -24.74 | 2.866 | 155.061 | 157.591 |
| 86.50055782818893 | -24.296 | 2.842 | 152.302 | 154.821 |
| 86.66790628486427 | -24.248 | 3.49 | 150.504 | 153.07 |
| 86.83525474153961 | -24.44 | 4.593 | 149.424 | 152.087 |
| 87.00260319821496 | -25.016 | 5.924 | 149.016 | 151.823 |
| 87.16995165489031 | -25.712 | 7.315 | 149.328 | 152.302 |
| 87.33730011156564 | -26.623 | 8.838 | 150.492 | 153.67 |
| 87.504648568241 | -27.702 | 10.421 | 152.578 | 155.984 |
| 87.67199702491634 | -28.686 | 11.716 | 155.097 | 158.706 |
| 87.83004834510972 | -28.59 | 11.956 | 156.871 | 160.457 |
| 87.99739680178506 | -28.338 | 11.812 | 157.831 | 161.369 |
| 88.1647452584604 | -27.834 | 11.249 | 157.831 | 161.273 |
| 88.33209371513574 | -26.923 | 10.157 | 157.003 | 160.265 |
| 88.49944217181108 | -25.771 | 8.838 | 155.468 | 158.538 |
| 88.66679062848644 | -24.596 | 7.519 | 153.106 | 155.996 |
| 88.83413908516178 | -23.541 | 6.632 | 149.784 | 152.53 |
| 89.00148754183712 | -22.677 | 6.008 | 146.834 | 149.484 |
| 89.16883599851246 | -22.474 | 6.296 | 145.083 | 147.757 |
| 89.33618445518782 | -22.45 | 6.98 | 143.764 | 146.462 |
| 89.50353291186315 | -22.809 | 8.179 | 143.308 | 146.126 |
| 89.6708813685385 | -23.469 | 9.57 | 143.596 | 146.57 |
| 89.83822982521386 | -24.476 | 11.201 | 144.375 | 147.565 |
| 90.00557828188919 | -25.592 | 12.736 | 145.922 | 149.352 |
| 90.16362960208257 | -26.875 | 14.403 | 147.853 | 151.571 |
| 90.3309780587579 | -27.846 | 15.866 | 150.06 | 154.005 |
| 90.49832651543326 | -28.254 | 16.441 | 151.871 | 155.888 |
| 90.66567497210859 | -28.17 | 16.25 | 153.082 | 157.015 |
| 90.83302342878395 | -27.81 | 15.698 | 153.897 | 157.675 |
| 91.00037188545929 | -27.223 | 14.858 | 154.329 | 157.891 |
| 91.16772034213463 | -26.335 | 13.791 | 154.149 | 157.423 |
| 91.33506879880998 | -25.292 | 12.34 | 153.646 | 156.608 |
| 91.50241725548533 | -24.021 | 10.697 | 152.842 | 155.492 |
| 91.66976571216065 | -22.689 | 8.97 | 151.607 | 153.969 |
| 91.83711416883601 | -21.562 | 7.387 | 149.244 | 151.379 |
| 92.00446262551137 | -20.615 | 6.272 | 146.834 | 148.801 |
| 92.1718110821867 | -19.859 | 5.349 | 144.735 | 146.558 |
| 92.33915953886203 | -19.607 | 5.145 | 143.632 | 145.419 |
| 92.49721085905541 | -19.619 | 5.445 | 143.128 | 144.903 |
| 92.66455931573077 | -20.075 | 6.296 | 143.404 | 145.251 |
| 92.83190777240611 | -20.723 | 7.399 | 144.16 | 146.114 |
| 92.99925622908145 | -21.598 | 8.455 | 146.054 | 148.153 |
| 93.1666046857568 | -22.677 | 10.014 | 148.045 | 150.348 |
| 93.33395314243214 | -23.685 | 11.213 | 150.659 | 153.154 |
| 93.50130159910749 | -24.608 | 12.484 | 153.717 | 156.404 |
| 93.66865005578283 | -25.807 | 13.539 | 158.359 | 161.249 |
| 93.83599851245818 | -26.419 | 13.252 | 164.043 | 166.933 |
| 94.00334696913353 | -27.259 | 12.916 | 170.711 | 173.613 |
| 94.17069542580886 | -28.062 | 12.712 | 177.282 | 180.22 |
| 94.3380438824842 | -28.65 | 12.556 | 182.991 | 185.953 |
| 94.50539233915954 | -28.985 | 12.604 | 187.632 | 190.606 |
| 94.66344365935292 | -29.225 | 12.724 | 191.913 | 194.887 |
| 94.83079211602828 | -29.369 | 12.724 | 195.007 | 197.969 |
| 94.99814057270362 | -29.405 | 12.568 | 196.566 | 199.516 |
| 95.16548902937897 | -28.985 | 11.98 | 196.506 | 199.348 |
| 95.33283748605432 | -29.165 | 11.92 | 195.703 | 198.557 |
| 95.50018594272963 | -29.429 | 11.932 | 194.839 | 197.717 |
| 95.66753439940499 | -28.83 | 12.364 | 192.501 | 195.331 |
| 95.83488285608034 | -28.086 | 12.796 | 190.15 | 192.932 |
| 96.00223131275567 | -26.659 | 13.18 | 187.788 | 190.462 |
| 96.16957976943102 | -25.424 | 13.311 | 185.809 | 188.363 |
| 96.33692822610638 | -25.136 | 13.096 | 185.605 | 188.087 |
| 96.50427668278171 | -25.136 | 12.988 | 185.917 | 188.363 |
| 96.67162513945706 | -24.572 | 13.383 | 183.998 | 186.468 |
| 96.8389735961324 | -23.889 | 13.863 | 181.744 | 184.238 |
| 96.99702491632577 | -23.109 | 14.199 | 179.837 | 182.355 |
| 97.16437337300111 | -21.766 | 12.808 | 178.254 | 180.568 |
| 97.33172182967647 | -20.483 | 11.417 | 175.939 | 178.074 |
| 97.49907028635181 | -19.356 | 10.433 | 172.797 | 174.812 |
| 97.66641874302715 | -17.881 | 9.786 | 169.571 | 171.466 |
| 97.8337671997025 | -17.281 | 9.414 | 166.501 | 168.36 |
| 98.00111565637785 | -17.125 | 9.198 | 163.791 | 165.65 |
| 98.16846411305319 | -17.029 | 9.366 | 161.932 | 163.815 |
| 98.33581256972855 | -17.089 | 9.63 | 160.589 | 162.496 |
| 98.50316102640389 | -17.341 | 10.038 | 159.618 | 161.572 |
| 98.67050948307921 | -17.497 | 10.253 | 159.642 | 161.632 |
| 98.83785793975456 | -17.377 | 10.145 | 158.299 | 160.301 |
| 99.0052063964299 | -17.125 | 9.774 | 157.015 | 159.006 |
| 99.17255485310525 | -17.437 | 10.205 | 156.476 | 158.55 |
| 99.33060617329863 | -18.276 | 11.237 | 156.859 | 159.114 |
| 99.49795462997399 | -19.284 | 12.388 | 157.843 | 160.301 |
| 99.66530308664933 | -20.327 | 13.551 | 159.606 | 162.268 |
| 99.83265154332467 | -21.298 | 14.619 | 161.812 | 164.666 |
| 100.0 | -22.066 | 15.29 | 163.815 | 166.813 |